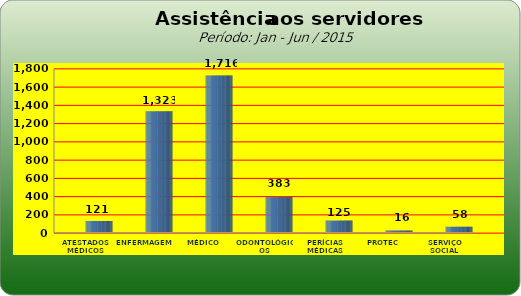
| Category | Series 0 |
|---|---|
| ATESTADOS MÉDICOS | 121 |
| ENFERMAGEM | 1323 |
| MÉDICO | 1716 |
| ODONTOLÓGICOS | 383 |
| PERÍCIAS MÉDICAS | 125 |
| PROTEC | 16 |
| SERVIÇO SOCIAL | 58 |